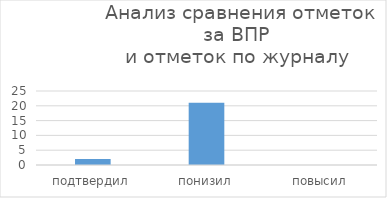
| Category | Series 0 |
|---|---|
| подтвердил | 2 |
| понизил | 21 |
| повысил | 0 |